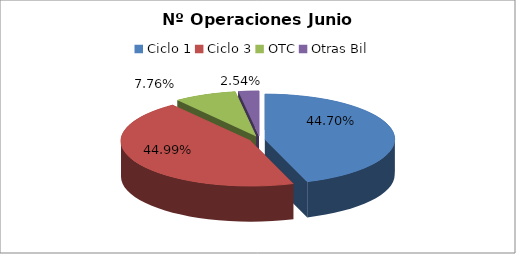
| Category | Series 0 |
|---|---|
| Ciclo 1 | 48478 |
| Ciclo 3 | 48790 |
| OTC | 8413 |
| Otras Bil | 2759 |